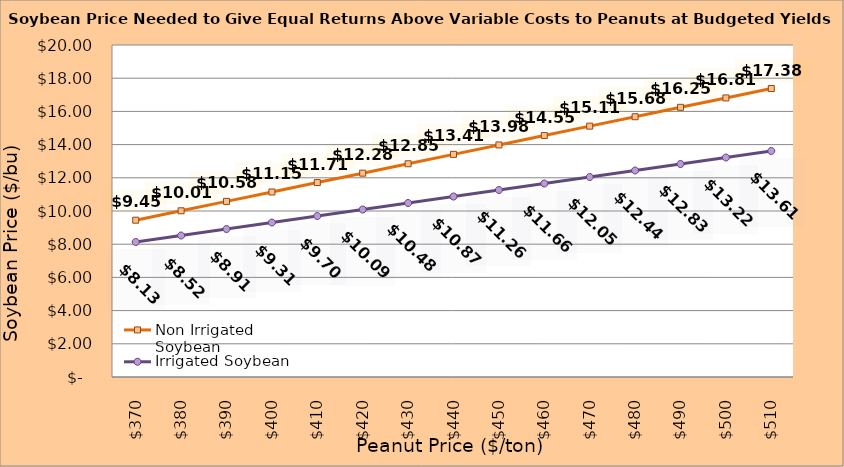
| Category | Non Irrigated Soybean | Irrigated Soybean |
|---|---|---|
| 370.0 | 9.446 | 8.131 |
| 380.0 | 10.013 | 8.522 |
| 390.0 | 10.579 | 8.914 |
| 400.0 | 11.146 | 9.306 |
| 410.0 | 11.713 | 9.697 |
| 420.0 | 12.279 | 10.089 |
| 430.0 | 12.846 | 10.481 |
| 440.0 | 13.413 | 10.872 |
| 450.0 | 13.979 | 11.264 |
| 460.0 | 14.546 | 11.656 |
| 470.0 | 15.113 | 12.047 |
| 480.0 | 15.679 | 12.439 |
| 490.0 | 16.246 | 12.831 |
| 500.0 | 16.813 | 13.222 |
| 510.0 | 17.379 | 13.614 |